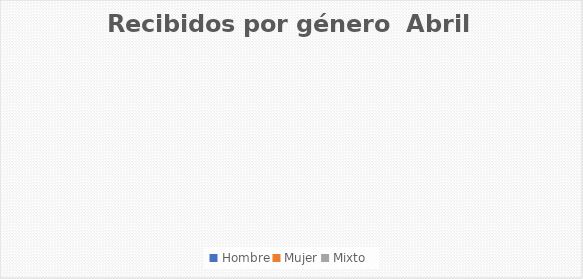
| Category | Recibidos por género  Abril |
|---|---|
| Hombre | 0 |
| Mujer | 0 |
| Mixto | 0 |